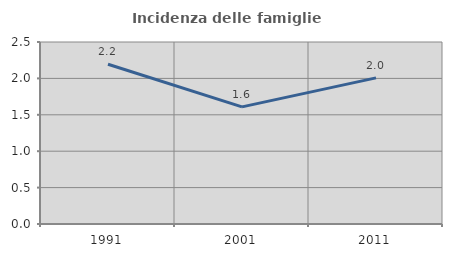
| Category | Incidenza delle famiglie numerose |
|---|---|
| 1991.0 | 2.195 |
| 2001.0 | 1.608 |
| 2011.0 | 2.007 |